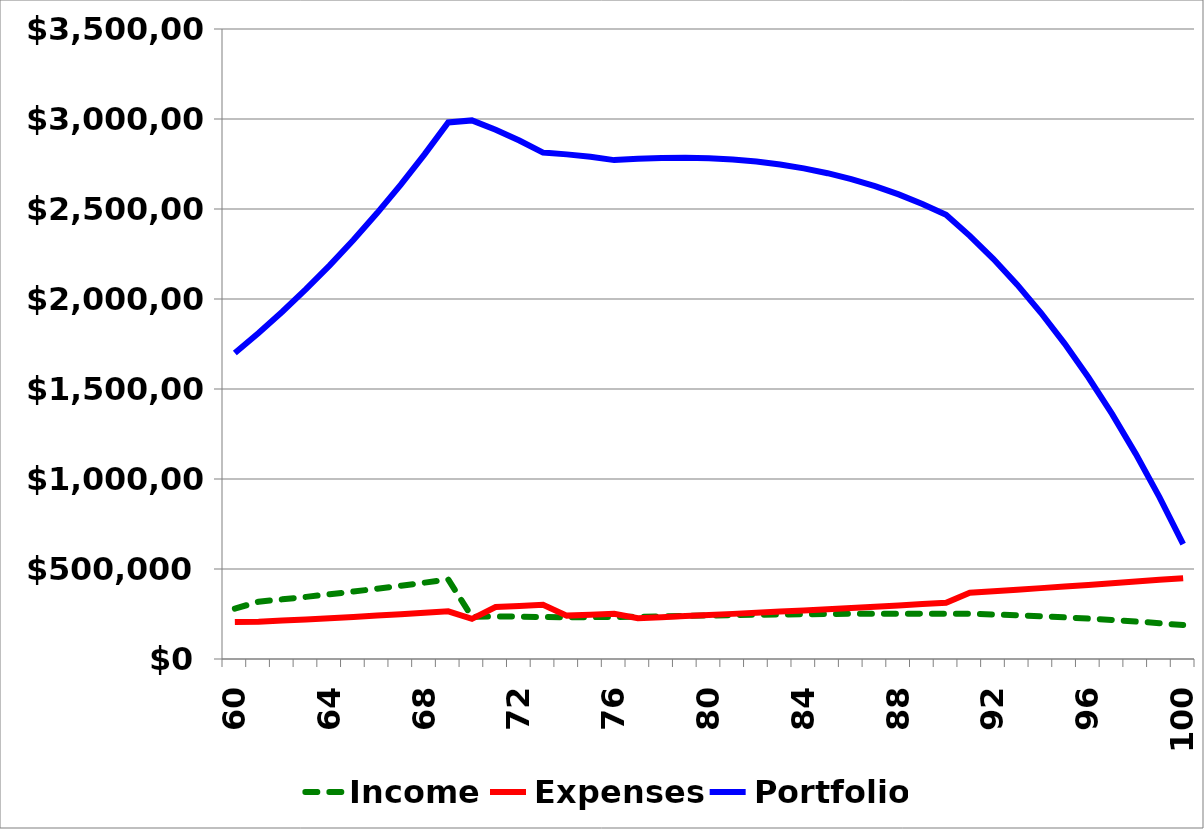
| Category | Income | Expenses | Portfolio |
|---|---|---|---|
| 60.0 | 280000 | 205000 | 1700000 |
| 61.0 | 318300 | 207176 | 1811124 |
| 62.0 | 331456.44 | 213464.917 | 1929115.523 |
| 63.0 | 345219.601 | 219989.147 | 2054345.977 |
| 64.0 | 359617.609 | 226757.934 | 2187205.652 |
| 65.0 | 374679.895 | 233780.899 | 2328104.648 |
| 66.0 | 390437.261 | 241068.059 | 2477473.85 |
| 67.0 | 406921.943 | 248629.845 | 2635765.948 |
| 68.0 | 424167.674 | 256477.116 | 2803456.506 |
| 69.0 | 442209.759 | 264621.182 | 2981045.083 |
| 70.0 | 234302.705 | 223181.681 | 2992166.108 |
| 71.0 | 236633.166 | 288599.672 | 2940199.602 |
| 72.0 | 235228.272 | 294666.807 | 2880761.068 |
| 73.0 | 233426.449 | 300837.903 | 2813349.614 |
| 74.0 | 231199.185 | 241028.41 | 2803520.388 |
| 75.0 | 232481.378 | 246295.431 | 2789706.336 |
| 76.0 | 233580.639 | 251671.754 | 2771615.221 |
| 77.0 | 234481.12 | 226692.815 | 2779403.526 |
| 78.0 | 236993.945 | 232498.846 | 2783898.626 |
| 79.0 | 239370.543 | 238432.503 | 2784836.666 |
| 80.0 | 241596.924 | 244495.436 | 2781938.154 |
| 81.0 | 243658.215 | 250689.243 | 2774907.126 |
| 82.0 | 245538.611 | 257015.464 | 2763430.273 |
| 83.0 | 247221.325 | 263475.57 | 2747176.029 |
| 84.0 | 248688.536 | 270070.963 | 2725793.602 |
| 85.0 | 249921.33 | 276802.962 | 2698911.97 |
| 86.0 | 250899.643 | 283672.799 | 2666138.815 |
| 87.0 | 251602.202 | 290681.608 | 2627059.408 |
| 88.0 | 252006.453 | 297830.417 | 2581235.445 |
| 89.0 | 252088.502 | 305120.138 | 2528203.81 |
| 90.0 | 251823.035 | 312551.555 | 2467475.29 |
| 91.0 | 251183.248 | 367768.751 | 2350889.788 |
| 92.0 | 247282.16 | 376285.765 | 2221886.183 |
| 93.0 | 242728.807 | 384940.538 | 2079674.453 |
| 94.0 | 237478.572 | 393731.692 | 1923421.333 |
| 95.0 | 231484.328 | 402657.55 | 1752248.111 |
| 96.0 | 224696.307 | 411716.116 | 1565228.302 |
| 97.0 | 217061.961 | 420905.047 | 1361385.215 |
| 98.0 | 208525.823 | 430221.64 | 1139689.399 |
| 99.0 | 199029.356 | 439662.795 | 899055.959 |
| 100.0 | 188510.789 | 449225.001 | 638341.747 |